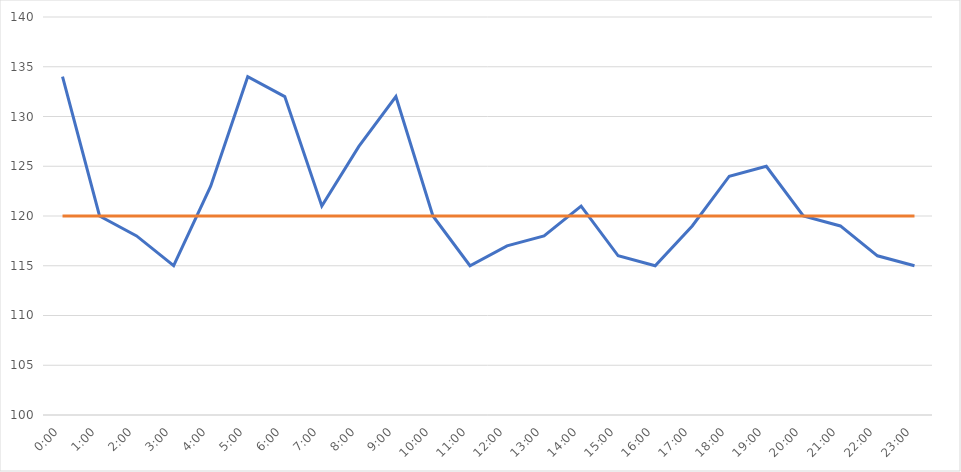
| Category | Series 0 | Series 1 |
|---|---|---|
| 0.0 | 134 | 120 |
| 0.041666666666666664 | 120 | 120 |
| 0.0833333333333333 | 118 | 120 |
| 0.125 | 115 | 120 |
| 0.166666666666667 | 123 | 120 |
| 0.208333333333333 | 134 | 120 |
| 0.25 | 132 | 120 |
| 0.291666666666667 | 121 | 120 |
| 0.333333333333333 | 127 | 120 |
| 0.375 | 132 | 120 |
| 0.416666666666667 | 120 | 120 |
| 0.458333333333333 | 115 | 120 |
| 0.5 | 117 | 120 |
| 0.541666666666667 | 118 | 120 |
| 0.583333333333333 | 121 | 120 |
| 0.625 | 116 | 120 |
| 0.666666666666667 | 115 | 120 |
| 0.708333333333333 | 119 | 120 |
| 0.75 | 124 | 120 |
| 0.791666666666667 | 125 | 120 |
| 0.833333333333333 | 120 | 120 |
| 0.875 | 119 | 120 |
| 0.916666666666667 | 116 | 120 |
| 0.958333333333333 | 115 | 120 |